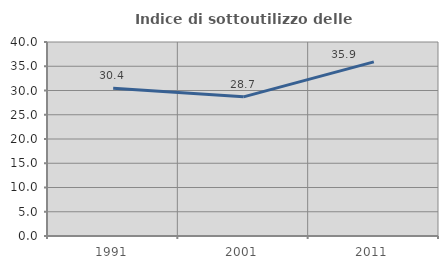
| Category | Indice di sottoutilizzo delle abitazioni  |
|---|---|
| 1991.0 | 30.442 |
| 2001.0 | 28.687 |
| 2011.0 | 35.903 |